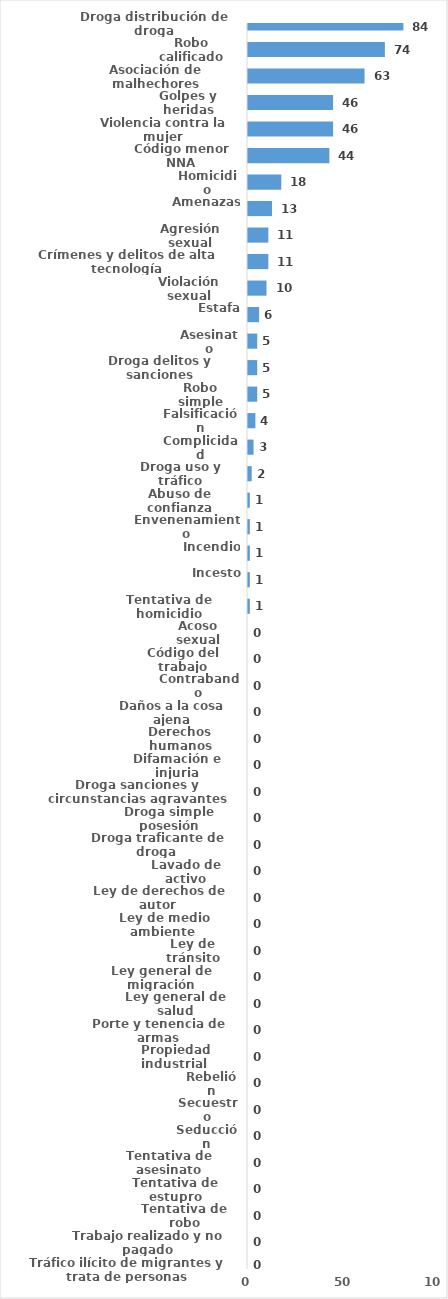
| Category | Series 0 |
|---|---|
| Droga distribución de droga | 84 |
| Robo calificado | 74 |
| Asociación de malhechores | 63 |
| Golpes y heridas | 46 |
| Violencia contra la mujer | 46 |
| Código menor NNA | 44 |
| Homicidio | 18 |
| Amenazas | 13 |
| Agresión sexual | 11 |
| Crímenes y delitos de alta tecnología | 11 |
| Violación sexual | 10 |
| Estafa | 6 |
| Asesinato | 5 |
| Droga delitos y sanciones | 5 |
| Robo simple | 5 |
| Falsificación | 4 |
| Complicidad | 3 |
| Droga uso y tráfico | 2 |
| Abuso de confianza | 1 |
| Envenenamiento | 1 |
| Incendio | 1 |
| Incesto | 1 |
| Tentativa de homicidio | 1 |
| Acoso sexual | 0 |
| Código del trabajo | 0 |
| Contrabando | 0 |
| Daños a la cosa ajena | 0 |
| Derechos humanos | 0 |
| Difamación e injuria | 0 |
| Droga sanciones y circunstancias agravantes | 0 |
| Droga simple posesión | 0 |
| Droga traficante de droga  | 0 |
| Lavado de activo | 0 |
| Ley de derechos de autor  | 0 |
| Ley de medio ambiente  | 0 |
| Ley de tránsito | 0 |
| Ley general de migración | 0 |
| Ley general de salud | 0 |
| Porte y tenencia de armas | 0 |
| Propiedad industrial  | 0 |
| Rebelión | 0 |
| Secuestro | 0 |
| Seducción | 0 |
| Tentativa de asesinato | 0 |
| Tentativa de estupro | 0 |
| Tentativa de robo | 0 |
| Trabajo realizado y no pagado | 0 |
| Tráfico ilícito de migrantes y trata de personas | 0 |